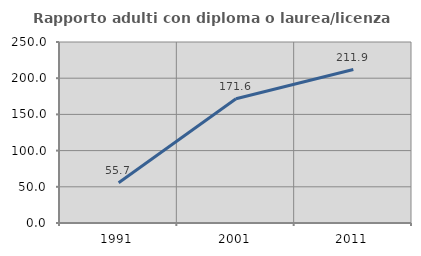
| Category | Rapporto adulti con diploma o laurea/licenza media  |
|---|---|
| 1991.0 | 55.725 |
| 2001.0 | 171.573 |
| 2011.0 | 211.927 |